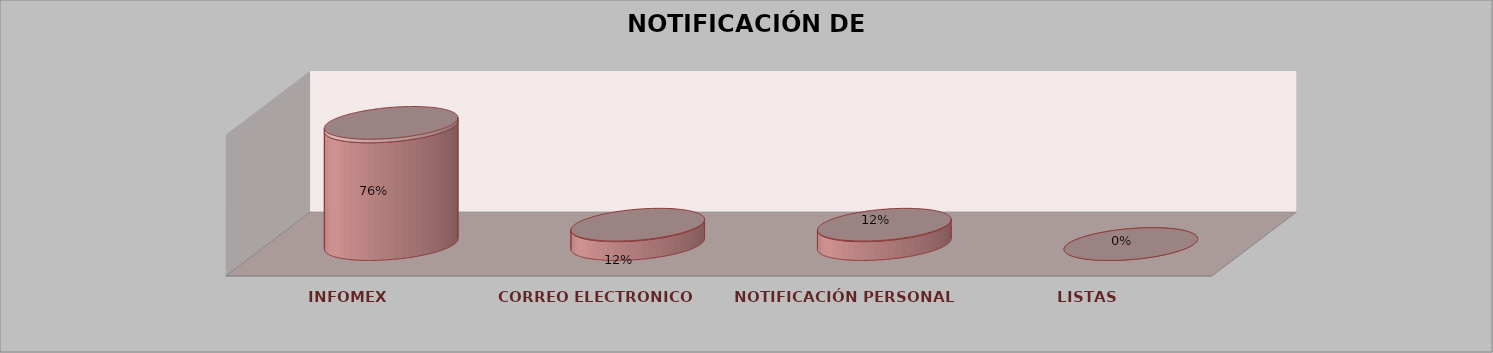
| Category | Series 0 | Series 1 | Series 2 | Series 3 | Series 4 |
|---|---|---|---|---|---|
| INFOMEX |  |  |  | 25 | 0.758 |
| CORREO ELECTRONICO |  |  |  | 4 | 0.121 |
| NOTIFICACIÓN PERSONAL |  |  |  | 4 | 0.121 |
| LISTAS |  |  |  | 0 | 0 |